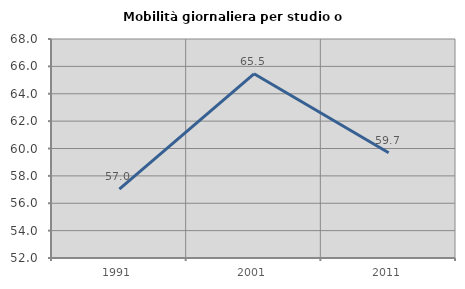
| Category | Mobilità giornaliera per studio o lavoro |
|---|---|
| 1991.0 | 57.033 |
| 2001.0 | 65.46 |
| 2011.0 | 59.689 |